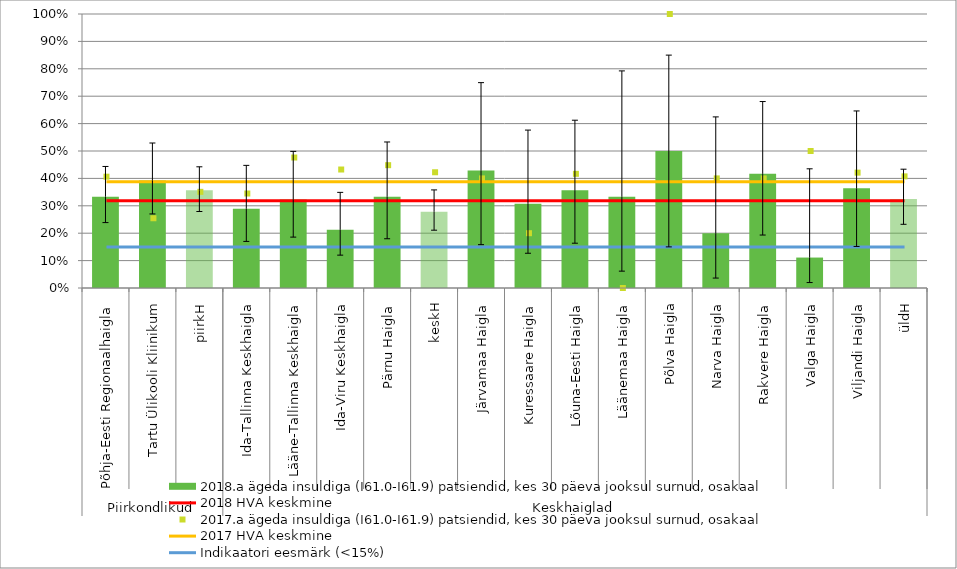
| Category | 2018.a ägeda insuldiga (I61.0-I61.9) patsiendid, kes 30 päeva jooksul surnud, osakaal |
|---|---|
| 0 | 0.333 |
| 1 | 0.392 |
| 2 | 0.357 |
| 3 | 0.289 |
| 4 | 0.323 |
| 5 | 0.213 |
| 6 | 0.333 |
| 7 | 0.279 |
| 8 | 0.429 |
| 9 | 0.308 |
| 10 | 0.357 |
| 11 | 0.333 |
| 12 | 0.5 |
| 13 | 0.2 |
| 14 | 0.417 |
| 15 | 0.111 |
| 16 | 0.364 |
| 17 | 0.325 |